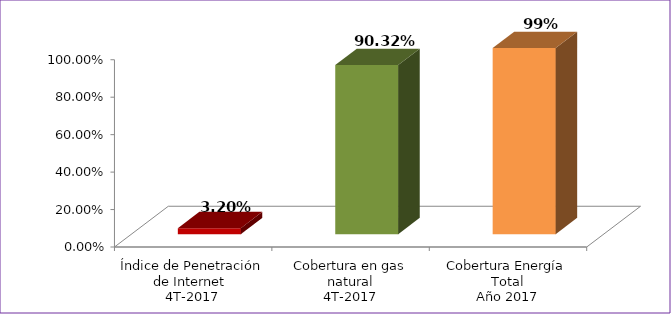
| Category | Series 0 |
|---|---|
| Índice de Penetración de Internet 
4T-2017 | 0.032 |
| Cobertura en gas natural
4T-2017 | 0.903 |
| Cobertura Energía Total
Año 2017 | 0.994 |